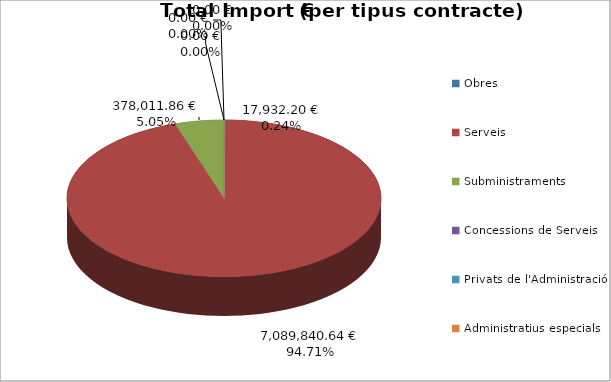
| Category | Total preu              (amb iva) |
|---|---|
| Obres | 17932.2 |
| Serveis | 7089840.64 |
| Subministraments | 378011.86 |
| Concessions de Serveis | 0 |
| Privats de l'Administració | 0 |
| Administratius especials | 0 |